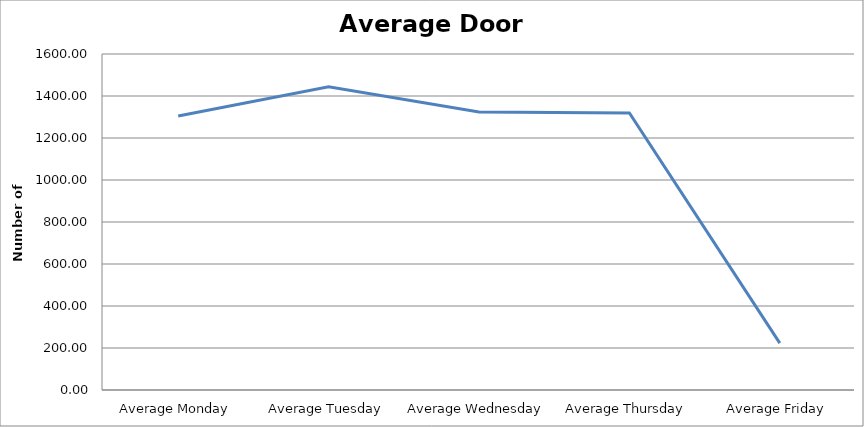
| Category | Series 0 |
|---|---|
| Average Monday | 1304.5 |
| Average Tuesday | 1444.25 |
| Average Wednesday | 1324.25 |
| Average Thursday | 1319.25 |
| Average Friday | 223 |